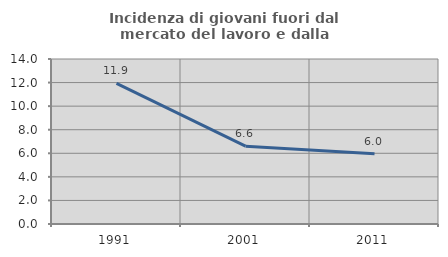
| Category | Incidenza di giovani fuori dal mercato del lavoro e dalla formazione  |
|---|---|
| 1991.0 | 11.927 |
| 2001.0 | 6.601 |
| 2011.0 | 5.952 |